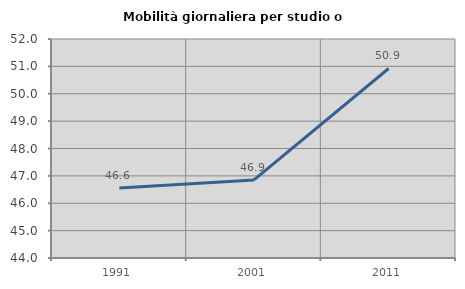
| Category | Mobilità giornaliera per studio o lavoro |
|---|---|
| 1991.0 | 46.557 |
| 2001.0 | 46.853 |
| 2011.0 | 50.923 |